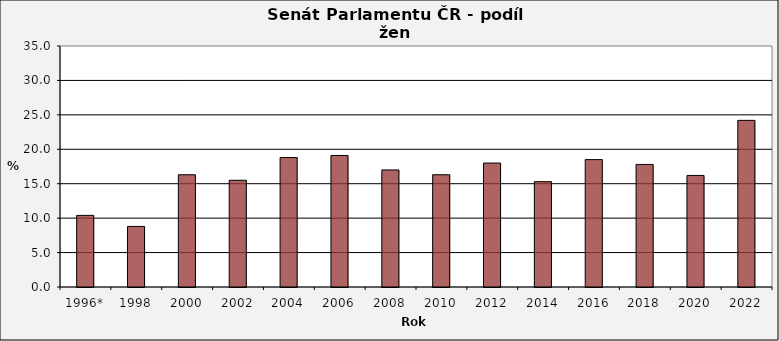
| Category |    - z toho ženy v % |
|---|---|
| 1996* | 10.4 |
| 1998 | 8.8 |
| 2000 | 16.3 |
| 2002 | 15.5 |
| 2004 | 18.8 |
| 2006 | 19.1 |
| 2008 | 17 |
| 2010 | 16.3 |
| 2012 | 18 |
| 2014 | 15.3 |
| 2016 | 18.5 |
| 2018 | 17.8 |
| 2020 | 16.2 |
| 2022 | 24.2 |